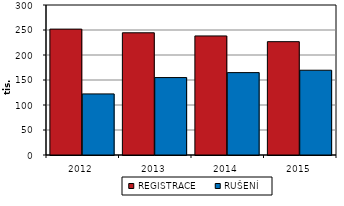
| Category | REGISTRACE | RUŠENÍ |
|---|---|---|
| 2012.0 | 251778 | 122161 |
| 2013.0 | 244427 | 154846 |
| 2014.0 | 238101 | 164751 |
| 2015.0 | 226685 | 169544 |